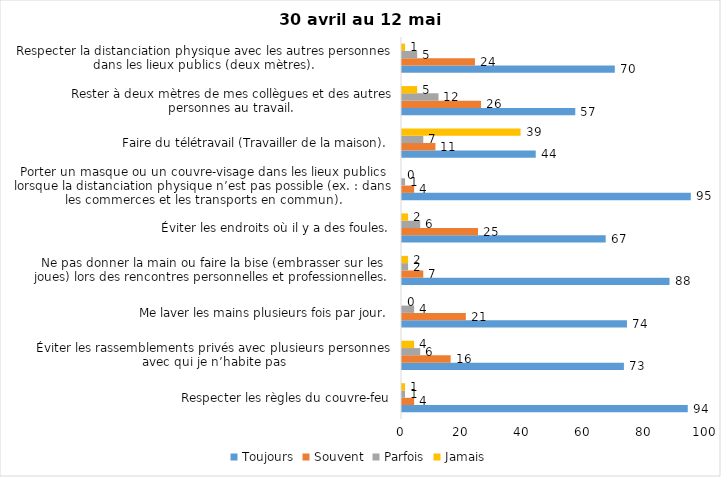
| Category | Toujours | Souvent | Parfois | Jamais |
|---|---|---|---|---|
| Respecter les règles du couvre-feu | 94 | 4 | 1 | 1 |
| Éviter les rassemblements privés avec plusieurs personnes avec qui je n’habite pas | 73 | 16 | 6 | 4 |
| Me laver les mains plusieurs fois par jour. | 74 | 21 | 4 | 0 |
| Ne pas donner la main ou faire la bise (embrasser sur les joues) lors des rencontres personnelles et professionnelles. | 88 | 7 | 2 | 2 |
| Éviter les endroits où il y a des foules. | 67 | 25 | 6 | 2 |
| Porter un masque ou un couvre-visage dans les lieux publics lorsque la distanciation physique n’est pas possible (ex. : dans les commerces et les transports en commun). | 95 | 4 | 1 | 0 |
| Faire du télétravail (Travailler de la maison). | 44 | 11 | 7 | 39 |
| Rester à deux mètres de mes collègues et des autres personnes au travail. | 57 | 26 | 12 | 5 |
| Respecter la distanciation physique avec les autres personnes dans les lieux publics (deux mètres). | 70 | 24 | 5 | 1 |